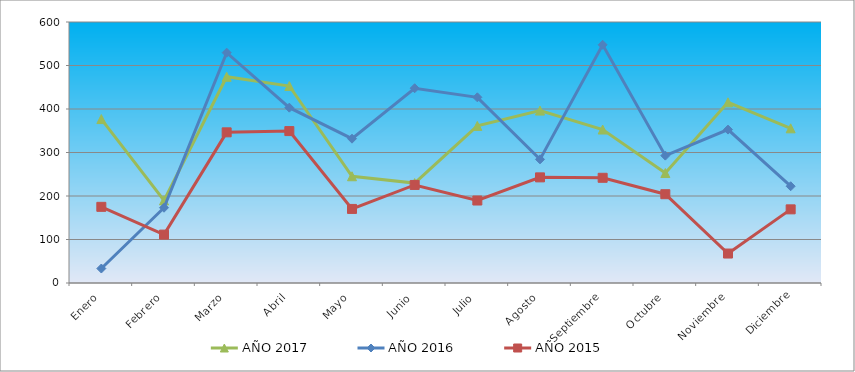
| Category | AÑO 2017 | AÑO 2016 | AÑO 2015 |
|---|---|---|---|
| Enero | 376.898 | 33.272 | 175.104 |
| Febrero | 189.838 | 173.014 | 111.254 |
| Marzo | 474.133 | 529.5 | 346.339 |
| Abril | 452.834 | 403.067 | 349.241 |
| Mayo | 245.401 | 331.769 | 170.267 |
| Junio | 229.658 | 447.746 | 225.411 |
| Julio | 361.156 | 426.832 | 189.616 |
| Agosto | 396.345 | 284.238 | 242.824 |
| Septiembre | 352.821 | 547.562 | 241.857 |
| Octubre | 252.809 | 292.794 | 204.127 |
| Noviembre | 415.329 | 352.683 | 67.72 |
| Diciembre | 355.599 | 222.447 | 169.3 |